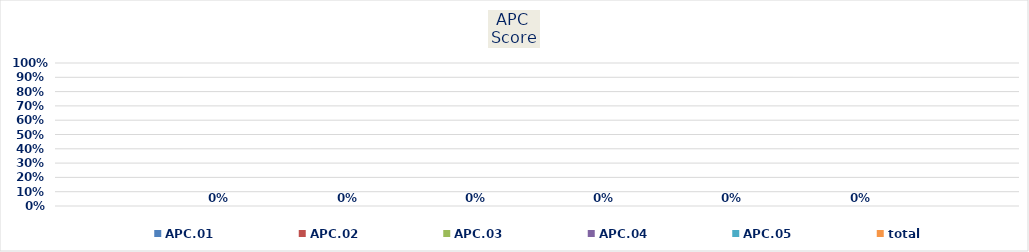
| Category | APC.01 | APC.02 | APC.03 | APC.04 | APC.05 | total  |
|---|---|---|---|---|---|---|
| 0 | 0 | 0 | 0 | 0 | 0 | 0 |